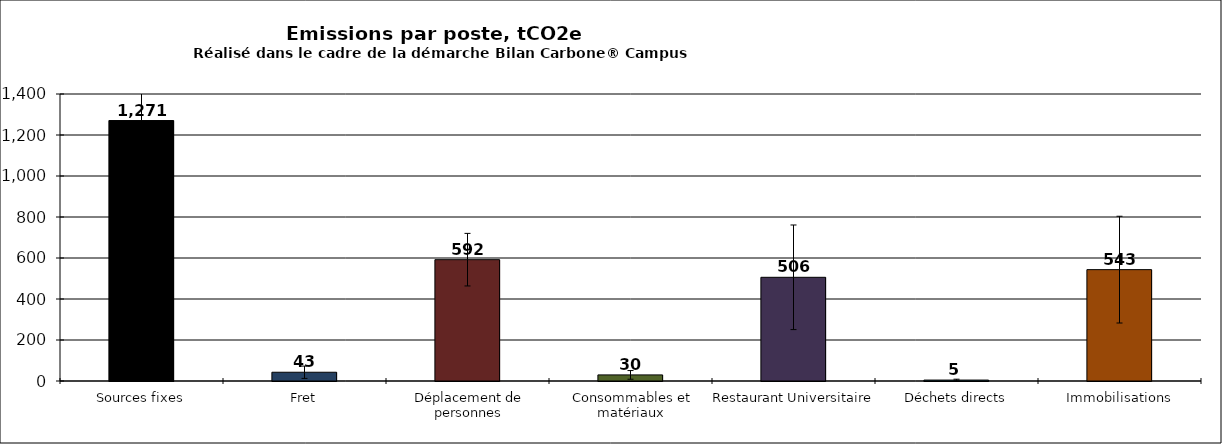
| Category | Series 3 |
|---|---|
| Sources fixes | 1270.553 |
| Fret | 42.72 |
| Déplacement de personnes | 591.853 |
| Consommables et matériaux | 29.799 |
| Restaurant Universitaire | 505.849 |
| Déchets directs | 4.541 |
| Immobilisations | 543.238 |